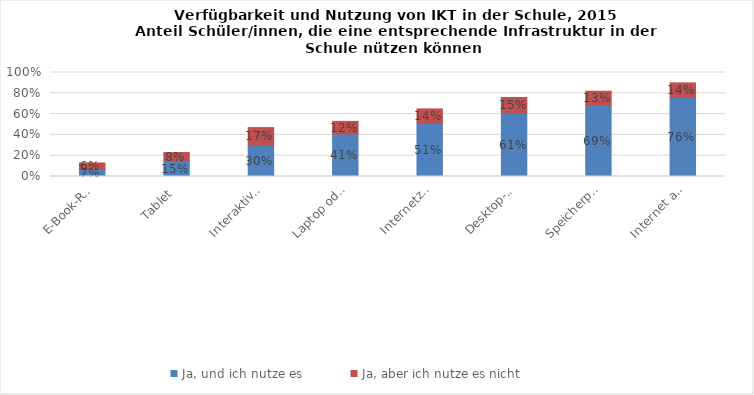
| Category | Ja, und ich nutze es | Ja, aber ich nutze es nicht |
|---|---|---|
| E-Book-Reader | 0.07 | 0.06 |
| Tablet | 0.15 | 0.08 |
| Interaktives Whiteboard | 0.3 | 0.17 |
| Laptop oder Notebook | 0.41 | 0.12 |
| Internetzugang (WLAN) | 0.51 | 0.14 |
| Desktop-Computer | 0.61 | 0.15 |
| Speicherplatz zum Speichern von Schulmaterial | 0.69 | 0.13 |
| Internet auf dem Schulcomputer | 0.76 | 0.14 |